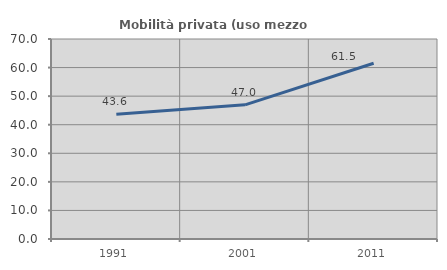
| Category | Mobilità privata (uso mezzo privato) |
|---|---|
| 1991.0 | 43.633 |
| 2001.0 | 46.962 |
| 2011.0 | 61.518 |